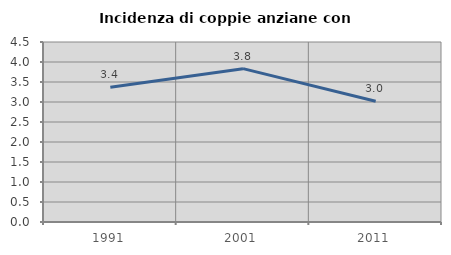
| Category | Incidenza di coppie anziane con figli |
|---|---|
| 1991.0 | 3.368 |
| 2001.0 | 3.834 |
| 2011.0 | 3.019 |